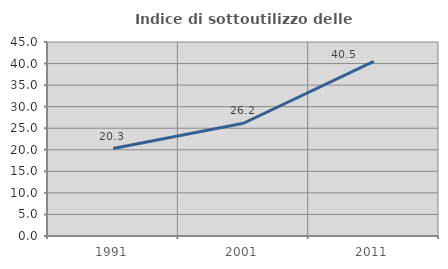
| Category | Indice di sottoutilizzo delle abitazioni  |
|---|---|
| 1991.0 | 20.282 |
| 2001.0 | 26.154 |
| 2011.0 | 40.517 |